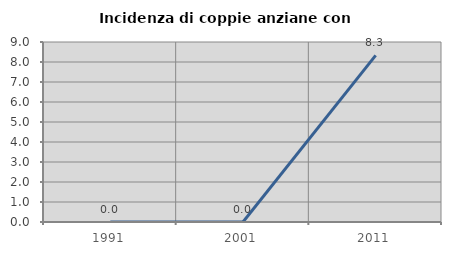
| Category | Incidenza di coppie anziane con figli |
|---|---|
| 1991.0 | 0 |
| 2001.0 | 0 |
| 2011.0 | 8.333 |